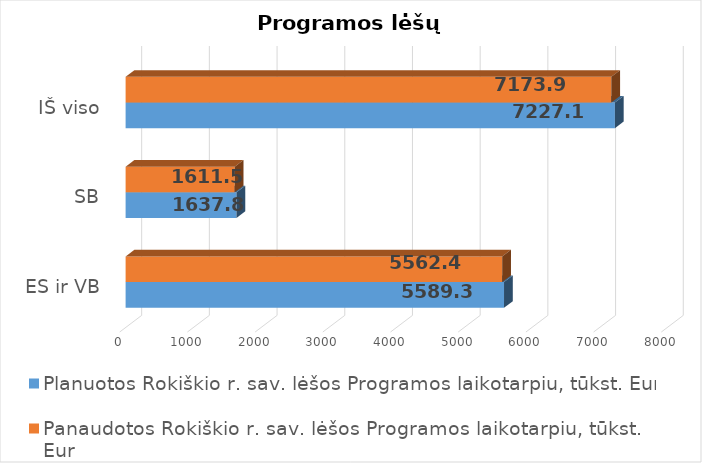
| Category | Planuotos Rokiškio r. sav. lėšos Programos laikotarpiu, tūkst. Eur | Panaudotos Rokiškio r. sav. lėšos Programos laikotarpiu, tūkst. Eur |
|---|---|---|
|  ES ir VB | 5589.3 | 5562.4 |
| SB | 1637.8 | 1611.5 |
| IŠ viso | 7227.1 | 7173.9 |